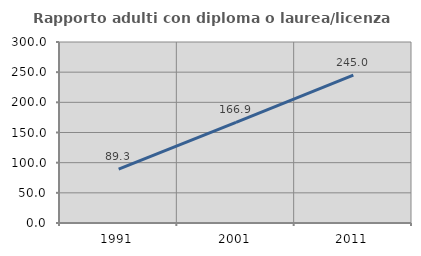
| Category | Rapporto adulti con diploma o laurea/licenza media  |
|---|---|
| 1991.0 | 89.27 |
| 2001.0 | 166.901 |
| 2011.0 | 245.033 |